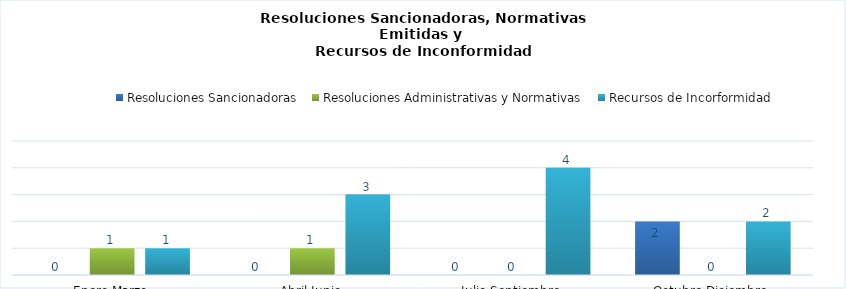
| Category | Resoluciones Sancionadoras | Resoluciones Administrativas y Normativas | Recursos de Incorformidad |
|---|---|---|---|
| Enero-Marzo | 0 | 1 | 1 |
| Abril-Junio | 0 | 1 | 3 |
| Julio-Septiembre | 0 | 0 | 4 |
| Octubre-Diciembre | 2 | 0 | 2 |